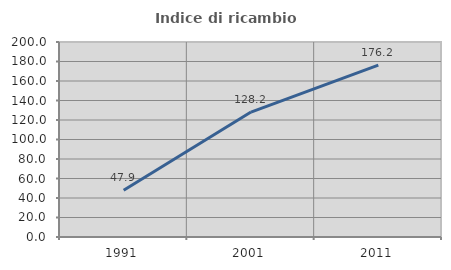
| Category | Indice di ricambio occupazionale  |
|---|---|
| 1991.0 | 47.857 |
| 2001.0 | 128.155 |
| 2011.0 | 176.19 |